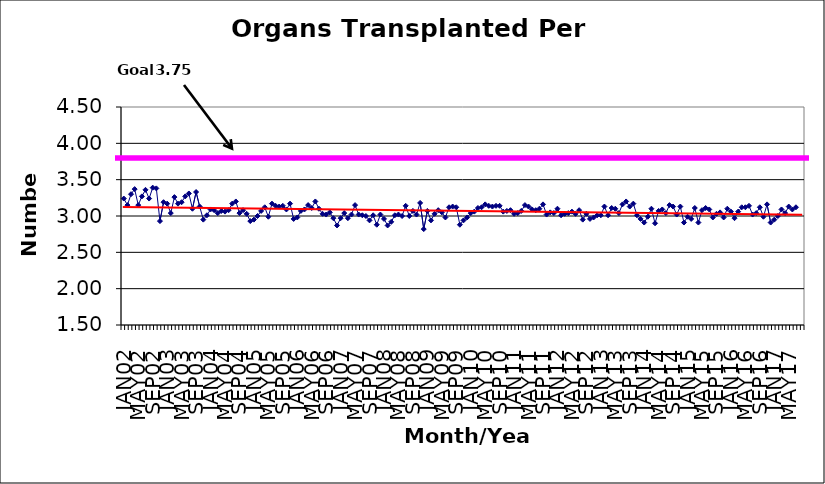
| Category | Series 0 |
|---|---|
| JAN02 | 3.24 |
| FEB02 | 3.15 |
| MAR02 | 3.3 |
| APR02 | 3.37 |
| MAY02 | 3.15 |
| JUN02 | 3.27 |
| JUL02 | 3.36 |
| AUG02 | 3.24 |
| SEP02 | 3.39 |
| OCT02 | 3.38 |
| NOV02 | 2.93 |
| DEC02 | 3.19 |
| JAN03 | 3.17 |
| FEB03 | 3.04 |
| MAR03 | 3.26 |
| APR03 | 3.17 |
| MAY03 | 3.19 |
| JUN03 | 3.27 |
| JUL03 | 3.31 |
| AUG03 | 3.1 |
| SEP03 | 3.33 |
| OCT03 | 3.13 |
| NOV03 | 2.95 |
| DEC03 | 3.01 |
| JAN04 | 3.09 |
| FEB04 | 3.08 |
| MAR04 | 3.04 |
| APR04 | 3.07 |
| MAY04 | 3.06 |
| JUN04 | 3.08 |
| JUL04 | 3.17 |
| AUG04 | 3.2 |
| SEP04 | 3.04 |
| OCT04 | 3.08 |
| NOV04 | 3.03 |
| DEC04 | 2.93 |
| JAN05 | 2.95 |
| FEB05 | 3 |
| MAR05 | 3.07 |
| APR05 | 3.12 |
| MAY05 | 2.99 |
| JUN05 | 3.17 |
| JUL05 | 3.14 |
| AUG05 | 3.13 |
| SEP05 | 3.14 |
| OCT05 | 3.09 |
| NOV05 | 3.17 |
| DEC05 | 2.96 |
| JAN06 | 2.98 |
| FEB06 | 3.07 |
| MAR06 | 3.09 |
| APR06 | 3.15 |
| MAY06 | 3.11 |
| JUN06 | 3.2 |
| JUL06 | 3.1 |
| AUG06 | 3.03 |
| SEP06 | 3.02 |
| OCT06 | 3.05 |
| NOV06 | 2.97 |
| DEC06 | 2.87 |
| JAN07 | 2.97 |
| FEB07 | 3.04 |
| MAR07 | 2.97 |
| APR07 | 3.02 |
| MAY07 | 3.15 |
| JUN07 | 3.02 |
| JUL07 | 3.01 |
| AUG07 | 3 |
| SEP07 | 2.94 |
| OCT07 | 3.01 |
| NOV07 | 2.88 |
| DEC07 | 3.02 |
| JAN08 | 2.96 |
| FEB08 | 2.87 |
| MAR08 | 2.92 |
| APR08 | 3.01 |
| MAY08 | 3.02 |
| JUN08 | 3 |
| JUL08 | 3.14 |
| AUG08 | 3 |
| SEP08 | 3.07 |
| OCT08 | 3.02 |
| NOV08 | 3.18 |
| DEC08 | 2.82 |
| JAN09 | 3.07 |
| FEB09 | 2.94 |
| MAR09 | 3.03 |
| APR09 | 3.08 |
| MAY09 | 3.05 |
| JUN09 | 2.98 |
| JUL09 | 3.12 |
| AUG09 | 3.13 |
| SEP09 | 3.12 |
| OCT09 | 2.88 |
| NOV09 | 2.94 |
| DEC09 | 2.98 |
| JAN10 | 3.04 |
| FEB10 | 3.06 |
| MAR10 | 3.11 |
| APR10 | 3.12 |
| MAY10 | 3.16 |
| JUN10 | 3.14 |
| JUL10 | 3.13 |
| AUG10 | 3.14 |
| SEP10 | 3.14 |
| OCT10 | 3.06 |
| NOV10 | 3.07 |
| DEC10 | 3.08 |
| JAN11 | 3.03 |
| FEB11 | 3.04 |
| MAR11 | 3.07 |
| APR11 | 3.15 |
| MAY11 | 3.13 |
| JUN11 | 3.09 |
| JUL11 | 3.08 |
| AUG11 | 3.1 |
| SEP11 | 3.16 |
| OCT11 | 3.02 |
| NOV11 | 3.05 |
| DEC11 | 3.04 |
| JAN12 | 3.1 |
| FEB12 | 3.01 |
| MAR12 | 3.03 |
| APR12 | 3.04 |
| MAY12 | 3.06 |
| JUN12 | 3.03 |
| JUL12 | 3.08 |
| AUG12 | 2.95 |
| SEP12 | 3.03 |
| OCT12 | 2.96 |
| NOV12 | 2.98 |
| DEC12 | 3.01 |
| JAN13 | 3.01 |
| FEB13 | 3.13 |
| MAR13 | 3.01 |
| APR13 | 3.11 |
| MAY13 | 3.1 |
| JUN13 | 3.04 |
| JUL13 | 3.16 |
| AUG13 | 3.2 |
| SEP13 | 3.13 |
| OCT13 | 3.17 |
| NOV13 | 3.01 |
| DEC13 | 2.96 |
| JAN14 | 2.91 |
| FEB14 | 2.99 |
| MAR14 | 3.1 |
| APR14 | 2.9 |
| MAY14 | 3.07 |
| JUN14 | 3.09 |
| JUL14 | 3.04 |
| AUG14 | 3.15 |
| SEP14 | 3.13 |
| OCT14 | 3.02 |
| NOV14 | 3.13 |
| DEC14 | 2.91 |
| JAN15 | 2.99 |
| FEB15 | 2.96 |
| MAR15 | 3.11 |
| APR15 | 2.91 |
| MAY15 | 3.08 |
| JUN15 | 3.11 |
| JUL15 | 3.09 |
| AUG15 | 2.98 |
| SEP15 | 3.03 |
| OCT15 | 3.05 |
| NOV15 | 2.98 |
| DEC15 | 3.1 |
| JAN16 | 3.06 |
| FEB16 | 2.97 |
| MAR16 | 3.06 |
| APR16 | 3.12 |
| MAY16 | 3.12 |
| JUN16 | 3.14 |
| JUL16 | 3.02 |
| AUG16 | 3.04 |
| SEP16 | 3.12 |
| OCT16 | 2.99 |
| NOV16 | 3.16 |
| DEC16 | 2.91 |
| JAN17 | 2.95 |
| FEB17 | 3 |
| MAR17 | 3.09 |
| APR17 | 3.04 |
| MAY17 | 3.13 |
| JUN17 | 3.09 |
| JUL17 | 3.12 |